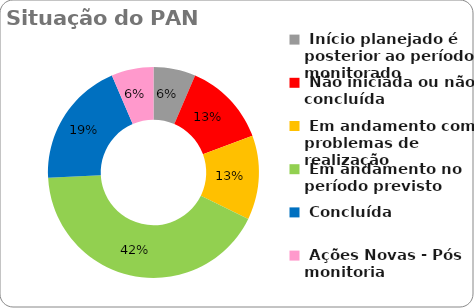
| Category | Series 0 |
|---|---|
|  Início planejado é posterior ao período monitorado | 0.065 |
|  Não iniciada ou não concluída | 0.129 |
|  Em andamento com problemas de realização | 0.129 |
|  Em andamento no período previsto  | 0.419 |
|  Concluída | 0.194 |
|  Ações Novas - Pós monitoria | 0.065 |